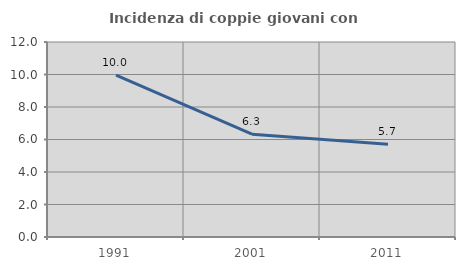
| Category | Incidenza di coppie giovani con figli |
|---|---|
| 1991.0 | 9.957 |
| 2001.0 | 6.329 |
| 2011.0 | 5.708 |